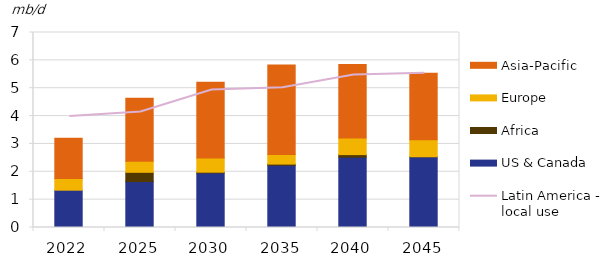
| Category | US & Canada | Africa | Europe | Asia-Pacific |
|---|---|---|---|---|
| 2022.0 | 1.339 | -0.003 | 0.421 | 1.444 |
| 2025.0 | 1.649 | 0.331 | 0.4 | 2.263 |
| 2030.0 | 1.959 | 0.026 | 0.512 | 2.717 |
| 2035.0 | 2.236 | 0.04 | 0.347 | 3.211 |
| 2040.0 | 2.524 | 0.092 | 0.594 | 2.64 |
| 2045.0 | 2.54 | 0 | 0.608 | 2.394 |